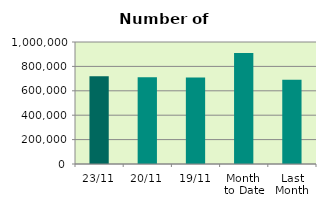
| Category | Series 0 |
|---|---|
| 23/11 | 719904 |
| 20/11 | 710102 |
| 19/11 | 708280 |
| Month 
to Date | 909116.625 |
| Last
Month | 689792.182 |